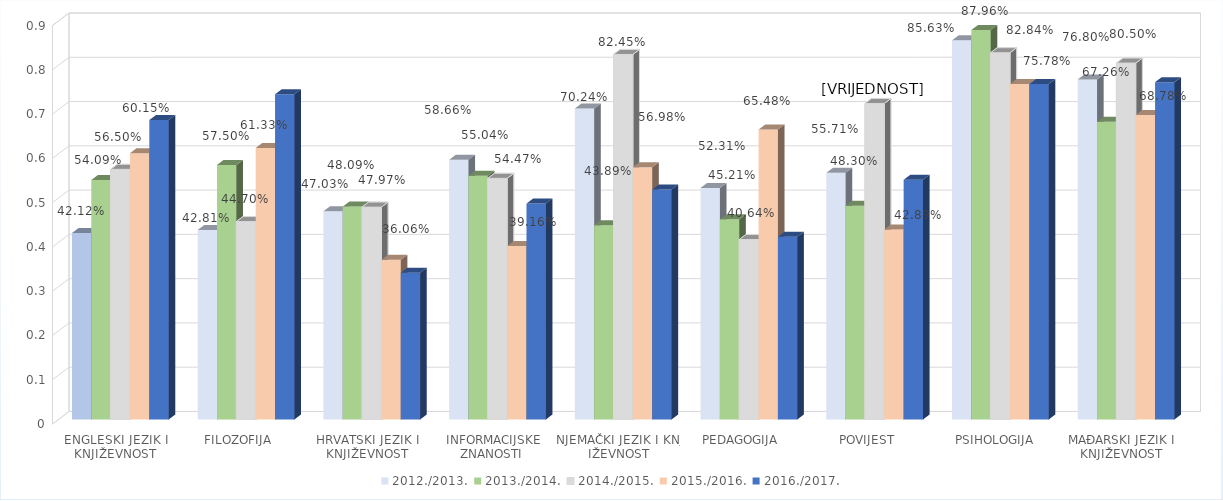
| Category | 2012./2013. | 2013./2014. | 2014./2015. | 2015./2016. | 2016./2017. |
|---|---|---|---|---|---|
| ENGLESKI JEZIK I KNJIŽEVNOST | 0.421 | 0.541 | 0.565 | 0.602 | 0.676 |
| FILOZOFIJA  | 0.428 | 0.575 | 0.447 | 0.613 | 0.734 |
| HRVATSKI JEZIK I KNJIŽEVNOST | 0.47 | 0.481 | 0.48 | 0.361 | 0.331 |
| INFORMACIJSKE ZNANOSTI  | 0.587 | 0.55 | 0.545 | 0.392 | 0.488 |
| NJEMAČKI JEZIK I KNJIŽEVNOST | 0.702 | 0.439 | 0.824 | 0.57 | 0.519 |
| PEDAGOGIJA  | 0.523 | 0.452 | 0.406 | 0.655 | 0.413 |
| POVIJEST  | 0.557 | 0.483 | 0.714 | 0.429 | 0.541 |
| PSIHOLOGIJA | 0.856 | 0.88 | 0.828 | 0.758 | 0.758 |
| MAĐARSKI JEZIK I KNJIŽEVNOST | 0.768 | 0.673 | 0.805 | 0.688 | 0.762 |